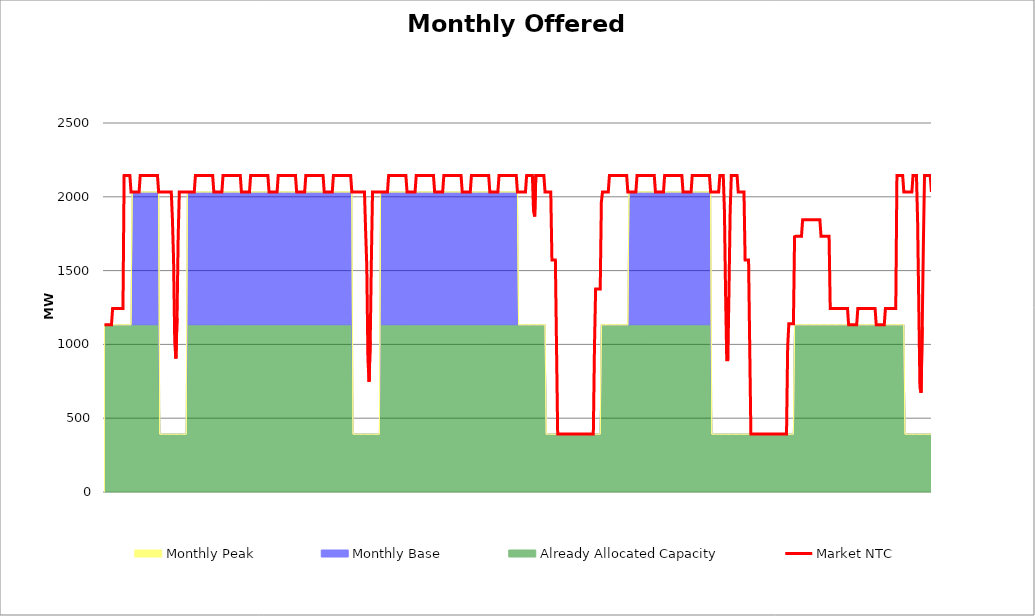
| Category | Market NTC |
|---|---|
| 0 | 1133 |
| 1 | 1133 |
| 2 | 1133 |
| 3 | 1133 |
| 4 | 1133 |
| 5 | 1133 |
| 6 | 1133 |
| 7 | 1244 |
| 8 | 1244 |
| 9 | 1244 |
| 10 | 1244 |
| 11 | 1244 |
| 12 | 1244 |
| 13 | 1244 |
| 14 | 1244 |
| 15 | 1244 |
| 16 | 1244 |
| 17 | 2144 |
| 18 | 2144 |
| 19 | 2144 |
| 20 | 2144 |
| 21 | 2144 |
| 22 | 2144 |
| 23 | 2033 |
| 24 | 2033 |
| 25 | 2033 |
| 26 | 2033 |
| 27 | 2033 |
| 28 | 2033 |
| 29 | 2033 |
| 30 | 2033 |
| 31 | 2144 |
| 32 | 2144 |
| 33 | 2144 |
| 34 | 2144 |
| 35 | 2144 |
| 36 | 2144 |
| 37 | 2144 |
| 38 | 2144 |
| 39 | 2144 |
| 40 | 2144 |
| 41 | 2144 |
| 42 | 2144 |
| 43 | 2144 |
| 44 | 2144 |
| 45 | 2144 |
| 46 | 2144 |
| 47 | 2033 |
| 48 | 2033 |
| 49 | 2033 |
| 50 | 2033 |
| 51 | 2033 |
| 52 | 2033 |
| 53 | 2033 |
| 54 | 2033 |
| 55 | 2033 |
| 56 | 2033 |
| 57 | 2033 |
| 58 | 2033 |
| 59 | 1847 |
| 60 | 1572 |
| 61 | 1022 |
| 62 | 904 |
| 63 | 1179 |
| 64 | 1729 |
| 65 | 2033 |
| 66 | 2033 |
| 67 | 2033 |
| 68 | 2033 |
| 69 | 2033 |
| 70 | 2033 |
| 71 | 2033 |
| 72 | 2033 |
| 73 | 2033 |
| 74 | 2033 |
| 75 | 2033 |
| 76 | 2033 |
| 77 | 2033 |
| 78 | 2033 |
| 79 | 2144 |
| 80 | 2144 |
| 81 | 2144 |
| 82 | 2144 |
| 83 | 2144 |
| 84 | 2144 |
| 85 | 2144 |
| 86 | 2144 |
| 87 | 2144 |
| 88 | 2144 |
| 89 | 2144 |
| 90 | 2144 |
| 91 | 2144 |
| 92 | 2144 |
| 93 | 2144 |
| 94 | 2144 |
| 95 | 2033 |
| 96 | 2033 |
| 97 | 2033 |
| 98 | 2033 |
| 99 | 2033 |
| 100 | 2033 |
| 101 | 2033 |
| 102 | 2033 |
| 103 | 2144 |
| 104 | 2144 |
| 105 | 2144 |
| 106 | 2144 |
| 107 | 2144 |
| 108 | 2144 |
| 109 | 2144 |
| 110 | 2144 |
| 111 | 2144 |
| 112 | 2144 |
| 113 | 2144 |
| 114 | 2144 |
| 115 | 2144 |
| 116 | 2144 |
| 117 | 2144 |
| 118 | 2144 |
| 119 | 2033 |
| 120 | 2033 |
| 121 | 2033 |
| 122 | 2033 |
| 123 | 2033 |
| 124 | 2033 |
| 125 | 2033 |
| 126 | 2033 |
| 127 | 2144 |
| 128 | 2144 |
| 129 | 2144 |
| 130 | 2144 |
| 131 | 2144 |
| 132 | 2144 |
| 133 | 2144 |
| 134 | 2144 |
| 135 | 2144 |
| 136 | 2144 |
| 137 | 2144 |
| 138 | 2144 |
| 139 | 2144 |
| 140 | 2144 |
| 141 | 2144 |
| 142 | 2144 |
| 143 | 2033 |
| 144 | 2033 |
| 145 | 2033 |
| 146 | 2033 |
| 147 | 2033 |
| 148 | 2033 |
| 149 | 2033 |
| 150 | 2033 |
| 151 | 2144 |
| 152 | 2144 |
| 153 | 2144 |
| 154 | 2144 |
| 155 | 2144 |
| 156 | 2144 |
| 157 | 2144 |
| 158 | 2144 |
| 159 | 2144 |
| 160 | 2144 |
| 161 | 2144 |
| 162 | 2144 |
| 163 | 2144 |
| 164 | 2144 |
| 165 | 2144 |
| 166 | 2144 |
| 167 | 2033 |
| 168 | 2033 |
| 169 | 2033 |
| 170 | 2033 |
| 171 | 2033 |
| 172 | 2033 |
| 173 | 2033 |
| 174 | 2033 |
| 175 | 2144 |
| 176 | 2144 |
| 177 | 2144 |
| 178 | 2144 |
| 179 | 2144 |
| 180 | 2144 |
| 181 | 2144 |
| 182 | 2144 |
| 183 | 2144 |
| 184 | 2144 |
| 185 | 2144 |
| 186 | 2144 |
| 187 | 2144 |
| 188 | 2144 |
| 189 | 2144 |
| 190 | 2144 |
| 191 | 2033 |
| 192 | 2033 |
| 193 | 2033 |
| 194 | 2033 |
| 195 | 2033 |
| 196 | 2033 |
| 197 | 2033 |
| 198 | 2033 |
| 199 | 2144 |
| 200 | 2144 |
| 201 | 2144 |
| 202 | 2144 |
| 203 | 2144 |
| 204 | 2144 |
| 205 | 2144 |
| 206 | 2144 |
| 207 | 2144 |
| 208 | 2144 |
| 209 | 2144 |
| 210 | 2144 |
| 211 | 2144 |
| 212 | 2144 |
| 213 | 2144 |
| 214 | 2144 |
| 215 | 2033 |
| 216 | 2033 |
| 217 | 2033 |
| 218 | 2033 |
| 219 | 2033 |
| 220 | 2033 |
| 221 | 2033 |
| 222 | 2033 |
| 223 | 2033 |
| 224 | 2033 |
| 225 | 2033 |
| 226 | 2033 |
| 227 | 1769 |
| 228 | 1533 |
| 229 | 904 |
| 230 | 747 |
| 231 | 1022 |
| 232 | 1572 |
| 233 | 2033 |
| 234 | 2033 |
| 235 | 2033 |
| 236 | 2033 |
| 237 | 2033 |
| 238 | 2033 |
| 239 | 2033 |
| 240 | 2033 |
| 241 | 2033 |
| 242 | 2033 |
| 243 | 2033 |
| 244 | 2033 |
| 245 | 2033 |
| 246 | 2033 |
| 247 | 2144 |
| 248 | 2144 |
| 249 | 2144 |
| 250 | 2144 |
| 251 | 2144 |
| 252 | 2144 |
| 253 | 2144 |
| 254 | 2144 |
| 255 | 2144 |
| 256 | 2144 |
| 257 | 2144 |
| 258 | 2144 |
| 259 | 2144 |
| 260 | 2144 |
| 261 | 2144 |
| 262 | 2144 |
| 263 | 2033 |
| 264 | 2033 |
| 265 | 2033 |
| 266 | 2033 |
| 267 | 2033 |
| 268 | 2033 |
| 269 | 2033 |
| 270 | 2033 |
| 271 | 2144 |
| 272 | 2144 |
| 273 | 2144 |
| 274 | 2144 |
| 275 | 2144 |
| 276 | 2144 |
| 277 | 2144 |
| 278 | 2144 |
| 279 | 2144 |
| 280 | 2144 |
| 281 | 2144 |
| 282 | 2144 |
| 283 | 2144 |
| 284 | 2144 |
| 285 | 2144 |
| 286 | 2144 |
| 287 | 2033 |
| 288 | 2033 |
| 289 | 2033 |
| 290 | 2033 |
| 291 | 2033 |
| 292 | 2033 |
| 293 | 2033 |
| 294 | 2033 |
| 295 | 2144 |
| 296 | 2144 |
| 297 | 2144 |
| 298 | 2144 |
| 299 | 2144 |
| 300 | 2144 |
| 301 | 2144 |
| 302 | 2144 |
| 303 | 2144 |
| 304 | 2144 |
| 305 | 2144 |
| 306 | 2144 |
| 307 | 2144 |
| 308 | 2144 |
| 309 | 2144 |
| 310 | 2144 |
| 311 | 2033 |
| 312 | 2033 |
| 313 | 2033 |
| 314 | 2033 |
| 315 | 2033 |
| 316 | 2033 |
| 317 | 2033 |
| 318 | 2033 |
| 319 | 2144 |
| 320 | 2144 |
| 321 | 2144 |
| 322 | 2144 |
| 323 | 2144 |
| 324 | 2144 |
| 325 | 2144 |
| 326 | 2144 |
| 327 | 2144 |
| 328 | 2144 |
| 329 | 2144 |
| 330 | 2144 |
| 331 | 2144 |
| 332 | 2144 |
| 333 | 2144 |
| 334 | 2144 |
| 335 | 2033 |
| 336 | 2033 |
| 337 | 2033 |
| 338 | 2033 |
| 339 | 2033 |
| 340 | 2033 |
| 341 | 2033 |
| 342 | 2033 |
| 343 | 2144 |
| 344 | 2144 |
| 345 | 2144 |
| 346 | 2144 |
| 347 | 2144 |
| 348 | 2144 |
| 349 | 2144 |
| 350 | 2144 |
| 351 | 2144 |
| 352 | 2144 |
| 353 | 2144 |
| 354 | 2144 |
| 355 | 2144 |
| 356 | 2144 |
| 357 | 2144 |
| 358 | 2144 |
| 359 | 2033 |
| 360 | 2033 |
| 361 | 2033 |
| 362 | 2033 |
| 363 | 2033 |
| 364 | 2033 |
| 365 | 2033 |
| 366 | 2033 |
| 367 | 2144 |
| 368 | 2144 |
| 369 | 2144 |
| 370 | 2144 |
| 371 | 2144 |
| 372 | 2144 |
| 373 | 1905 |
| 374 | 1867 |
| 375 | 2144 |
| 376 | 2144 |
| 377 | 2144 |
| 378 | 2144 |
| 379 | 2144 |
| 380 | 2144 |
| 381 | 2144 |
| 382 | 2144 |
| 383 | 2033 |
| 384 | 2033 |
| 385 | 2033 |
| 386 | 2033 |
| 387 | 2033 |
| 388 | 2033 |
| 389 | 1572 |
| 390 | 1572 |
| 391 | 1572 |
| 392 | 1572 |
| 393 | 983 |
| 394 | 393 |
| 395 | 393 |
| 396 | 393 |
| 397 | 393 |
| 398 | 393 |
| 399 | 393 |
| 400 | 393 |
| 401 | 393 |
| 402 | 393 |
| 403 | 393 |
| 404 | 393 |
| 405 | 393 |
| 406 | 393 |
| 407 | 393 |
| 408 | 393 |
| 409 | 393 |
| 410 | 393 |
| 411 | 393 |
| 412 | 393 |
| 413 | 393 |
| 414 | 393 |
| 415 | 393 |
| 416 | 393 |
| 417 | 393 |
| 418 | 393 |
| 419 | 393 |
| 420 | 393 |
| 421 | 393 |
| 422 | 393 |
| 423 | 393 |
| 424 | 393 |
| 425 | 393 |
| 426 | 983 |
| 427 | 1376 |
| 428 | 1376 |
| 429 | 1376 |
| 430 | 1376 |
| 431 | 1376 |
| 432 | 1965 |
| 433 | 2033 |
| 434 | 2033 |
| 435 | 2033 |
| 436 | 2033 |
| 437 | 2033 |
| 438 | 2033 |
| 439 | 2144 |
| 440 | 2144 |
| 441 | 2144 |
| 442 | 2144 |
| 443 | 2144 |
| 444 | 2144 |
| 445 | 2144 |
| 446 | 2144 |
| 447 | 2144 |
| 448 | 2144 |
| 449 | 2144 |
| 450 | 2144 |
| 451 | 2144 |
| 452 | 2144 |
| 453 | 2144 |
| 454 | 2144 |
| 455 | 2033 |
| 456 | 2033 |
| 457 | 2033 |
| 458 | 2033 |
| 459 | 2033 |
| 460 | 2033 |
| 461 | 2033 |
| 462 | 2033 |
| 463 | 2144 |
| 464 | 2144 |
| 465 | 2144 |
| 466 | 2144 |
| 467 | 2144 |
| 468 | 2144 |
| 469 | 2144 |
| 470 | 2144 |
| 471 | 2144 |
| 472 | 2144 |
| 473 | 2144 |
| 474 | 2144 |
| 475 | 2144 |
| 476 | 2144 |
| 477 | 2144 |
| 478 | 2144 |
| 479 | 2033 |
| 480 | 2033 |
| 481 | 2033 |
| 482 | 2033 |
| 483 | 2033 |
| 484 | 2033 |
| 485 | 2033 |
| 486 | 2033 |
| 487 | 2144 |
| 488 | 2144 |
| 489 | 2144 |
| 490 | 2144 |
| 491 | 2144 |
| 492 | 2144 |
| 493 | 2144 |
| 494 | 2144 |
| 495 | 2144 |
| 496 | 2144 |
| 497 | 2144 |
| 498 | 2144 |
| 499 | 2144 |
| 500 | 2144 |
| 501 | 2144 |
| 502 | 2144 |
| 503 | 2033 |
| 504 | 2033 |
| 505 | 2033 |
| 506 | 2033 |
| 507 | 2033 |
| 508 | 2033 |
| 509 | 2033 |
| 510 | 2033 |
| 511 | 2144 |
| 512 | 2144 |
| 513 | 2144 |
| 514 | 2144 |
| 515 | 2144 |
| 516 | 2144 |
| 517 | 2144 |
| 518 | 2144 |
| 519 | 2144 |
| 520 | 2144 |
| 521 | 2144 |
| 522 | 2144 |
| 523 | 2144 |
| 524 | 2144 |
| 525 | 2144 |
| 526 | 2144 |
| 527 | 2033 |
| 528 | 2033 |
| 529 | 2033 |
| 530 | 2033 |
| 531 | 2033 |
| 532 | 2033 |
| 533 | 2033 |
| 534 | 2033 |
| 535 | 2144 |
| 536 | 2144 |
| 537 | 2144 |
| 538 | 2144 |
| 539 | 1905 |
| 540 | 1344 |
| 541 | 896 |
| 542 | 896 |
| 543 | 1382 |
| 544 | 1905 |
| 545 | 2144 |
| 546 | 2144 |
| 547 | 2144 |
| 548 | 2144 |
| 549 | 2144 |
| 550 | 2144 |
| 551 | 2033 |
| 552 | 2033 |
| 553 | 2033 |
| 554 | 2033 |
| 555 | 2033 |
| 556 | 2033 |
| 557 | 1572 |
| 558 | 1572 |
| 559 | 1572 |
| 560 | 1572 |
| 561 | 983 |
| 562 | 393 |
| 563 | 393 |
| 564 | 393 |
| 565 | 393 |
| 566 | 393 |
| 567 | 393 |
| 568 | 393 |
| 569 | 393 |
| 570 | 393 |
| 571 | 393 |
| 572 | 393 |
| 573 | 393 |
| 574 | 393 |
| 575 | 393 |
| 576 | 393 |
| 577 | 393 |
| 578 | 393 |
| 579 | 393 |
| 580 | 393 |
| 581 | 393 |
| 582 | 393 |
| 583 | 393 |
| 584 | 393 |
| 585 | 393 |
| 586 | 393 |
| 587 | 393 |
| 588 | 393 |
| 589 | 393 |
| 590 | 393 |
| 591 | 393 |
| 592 | 393 |
| 593 | 393 |
| 594 | 983 |
| 595 | 1140 |
| 596 | 1140 |
| 597 | 1140 |
| 598 | 1140 |
| 599 | 1140 |
| 600 | 1729 |
| 601 | 1733 |
| 602 | 1733 |
| 603 | 1733 |
| 604 | 1733 |
| 605 | 1733 |
| 606 | 1733 |
| 607 | 1844 |
| 608 | 1844 |
| 609 | 1844 |
| 610 | 1844 |
| 611 | 1844 |
| 612 | 1844 |
| 613 | 1844 |
| 614 | 1844 |
| 615 | 1844 |
| 616 | 1844 |
| 617 | 1844 |
| 618 | 1844 |
| 619 | 1844 |
| 620 | 1844 |
| 621 | 1844 |
| 622 | 1844 |
| 623 | 1733 |
| 624 | 1733 |
| 625 | 1733 |
| 626 | 1733 |
| 627 | 1733 |
| 628 | 1733 |
| 629 | 1733 |
| 630 | 1733 |
| 631 | 1244 |
| 632 | 1244 |
| 633 | 1244 |
| 634 | 1244 |
| 635 | 1244 |
| 636 | 1244 |
| 637 | 1244 |
| 638 | 1244 |
| 639 | 1244 |
| 640 | 1244 |
| 641 | 1244 |
| 642 | 1244 |
| 643 | 1244 |
| 644 | 1244 |
| 645 | 1244 |
| 646 | 1244 |
| 647 | 1133 |
| 648 | 1133 |
| 649 | 1133 |
| 650 | 1133 |
| 651 | 1133 |
| 652 | 1133 |
| 653 | 1133 |
| 654 | 1133 |
| 655 | 1244 |
| 656 | 1244 |
| 657 | 1244 |
| 658 | 1244 |
| 659 | 1244 |
| 660 | 1244 |
| 661 | 1244 |
| 662 | 1244 |
| 663 | 1244 |
| 664 | 1244 |
| 665 | 1244 |
| 666 | 1244 |
| 667 | 1244 |
| 668 | 1244 |
| 669 | 1244 |
| 670 | 1244 |
| 671 | 1133 |
| 672 | 1133 |
| 673 | 1133 |
| 674 | 1133 |
| 675 | 1133 |
| 676 | 1133 |
| 677 | 1133 |
| 678 | 1133 |
| 679 | 1244 |
| 680 | 1244 |
| 681 | 1244 |
| 682 | 1244 |
| 683 | 1244 |
| 684 | 1244 |
| 685 | 1244 |
| 686 | 1244 |
| 687 | 1244 |
| 688 | 1244 |
| 689 | 2144 |
| 690 | 2144 |
| 691 | 2144 |
| 692 | 2144 |
| 693 | 2144 |
| 694 | 2144 |
| 695 | 2033 |
| 696 | 2033 |
| 697 | 2033 |
| 698 | 2033 |
| 699 | 2033 |
| 700 | 2033 |
| 701 | 2033 |
| 702 | 2033 |
| 703 | 2144 |
| 704 | 2144 |
| 705 | 2144 |
| 706 | 2144 |
| 707 | 1830 |
| 708 | 1270 |
| 709 | 710 |
| 710 | 672 |
| 711 | 1120 |
| 712 | 1680 |
| 713 | 2144 |
| 714 | 2144 |
| 715 | 2144 |
| 716 | 2144 |
| 717 | 2144 |
| 718 | 2144 |
| 719 | 2033 |